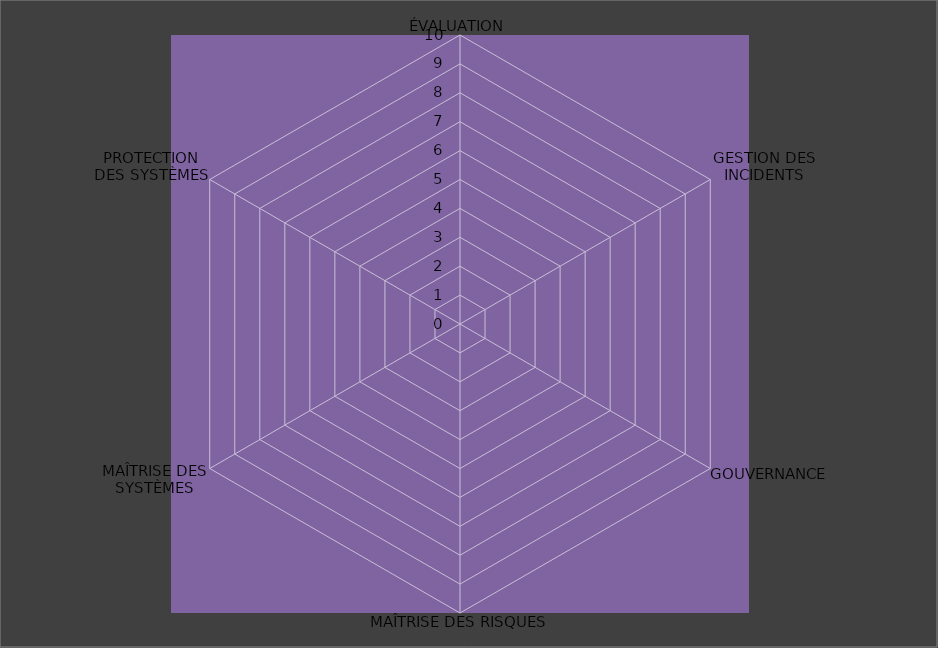
| Category | Année 2022 |
|---|---|
| ÉVALUATION | 0 |
| GESTION DES INCIDENTS | 0 |
| GOUVERNANCE | 0 |
| MAÎTRISE DES RISQUES | 0 |
| MAÎTRISE DES SYSTÈMES | 0 |
| PROTECTION
DES SYSTÈMES | 0 |